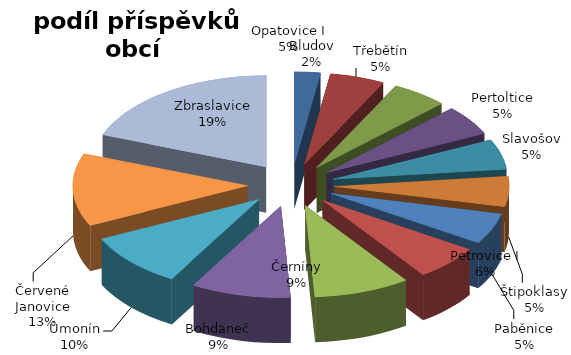
| Category | Series 0 |
|---|---|
| Bludov | 8060 |
| Třebětín | 17140 |
| Opatovice I | 17540 |
| Pertoltice | 17800 |
| Slavošov | 17920 |
| Štipoklasy | 18040 |
| Paběnice | 18480 |
| Petrovice I | 20820 |
| Černíny | 30000 |
| Bohdaneč | 31120 |
| Úmonín | 32220 |
| Červené Janovice | 43320 |
| Zbraslavice | 65160 |